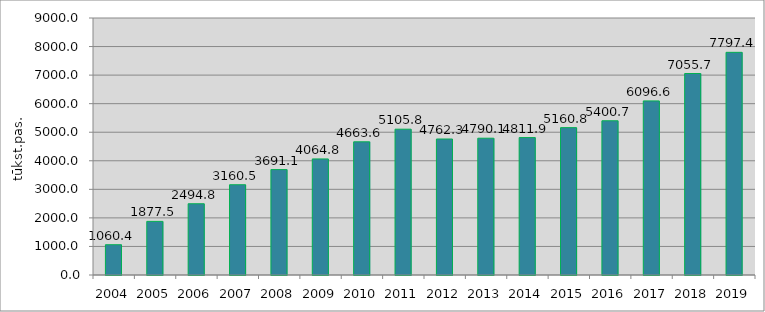
| Category | Series 0 |
|---|---|
| 2004.0 | 1060.384 |
| 2005.0 | 1877.461 |
| 2006.0 | 2494.835 |
| 2007.0 | 3160.535 |
| 2008.0 | 3691.099 |
| 2009.0 | 4064.755 |
| 2010.0 | 4663.647 |
| 2011.0 | 5105.818 |
| 2012.0 | 4762.335 |
| 2013.0 | 4790.136 |
| 2014.0 | 4811.949 |
| 2015.0 | 5160.759 |
| 2016.0 | 5400.709 |
| 2017.0 | 6096.62 |
| 2018.0 | 7055.734 |
| 2019.0 | 7797.4 |